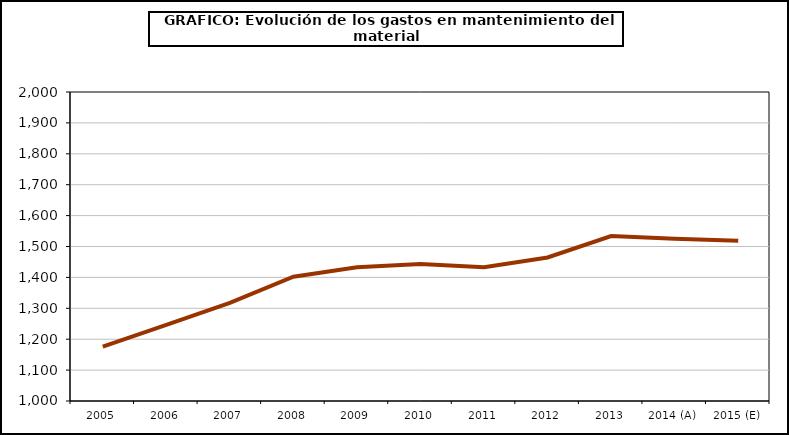
| Category | producción |
|---|---|
| 2005 | 1175.74 |
| 2006 | 1246.057 |
| 2007 | 1317.25 |
| 2008 | 1402.028 |
| 2009 | 1432.557 |
| 2010 | 1443.194 |
| 2011 | 1432.619 |
| 2012 | 1464.429 |
| 2013 | 1533.609 |
| 2014 (A) | 1525.388 |
| 2015 (E) | 1518.446 |